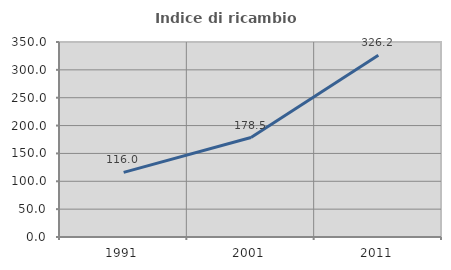
| Category | Indice di ricambio occupazionale  |
|---|---|
| 1991.0 | 116 |
| 2001.0 | 178.481 |
| 2011.0 | 326.154 |